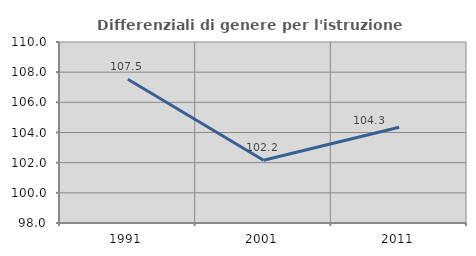
| Category | Differenziali di genere per l'istruzione superiore |
|---|---|
| 1991.0 | 107.526 |
| 2001.0 | 102.157 |
| 2011.0 | 104.347 |